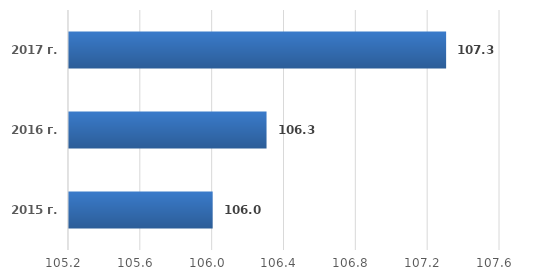
| Category | Series 0 |
|---|---|
| 2015 г. | 106 |
| 2016 г. | 106.3 |
| 2017 г. | 107.3 |